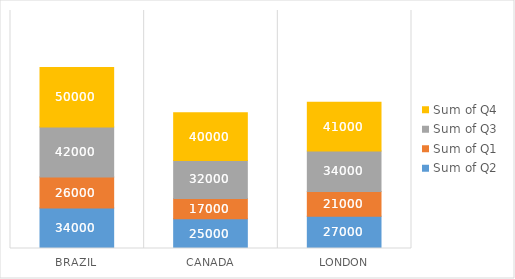
| Category | Sum of Q2 | Sum of Q1 | Sum of Q3 | Sum of Q4 |
|---|---|---|---|---|
| Brazil | 34000 | 26000 | 42000 | 50000 |
| Canada | 25000 | 17000 | 32000 | 40000 |
| London | 27000 | 21000 | 34000 | 41000 |